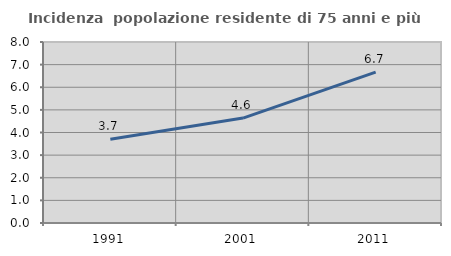
| Category | Incidenza  popolazione residente di 75 anni e più |
|---|---|
| 1991.0 | 3.702 |
| 2001.0 | 4.636 |
| 2011.0 | 6.669 |